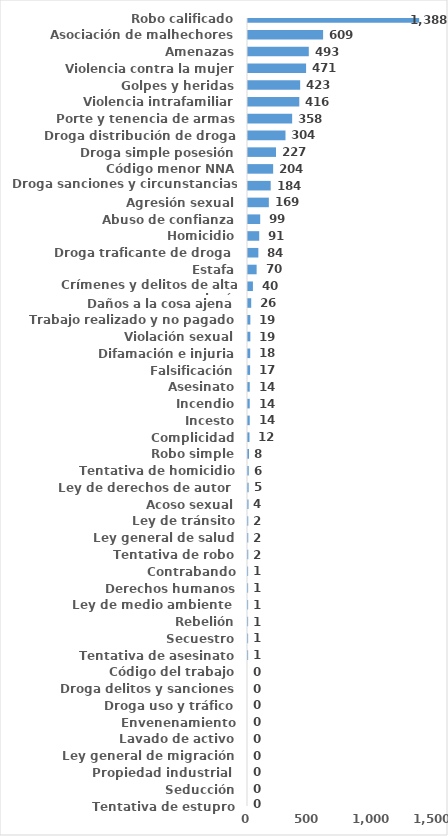
| Category | Series 0 |
|---|---|
| Robo calificado | 1388 |
| Asociación de malhechores | 609 |
| Amenazas | 493 |
| Violencia contra la mujer | 471 |
| Golpes y heridas | 423 |
| Violencia intrafamiliar | 416 |
| Porte y tenencia de armas | 358 |
| Droga distribución de droga | 304 |
| Droga simple posesión | 227 |
| Código menor NNA | 204 |
| Droga sanciones y circunstancias agravantes | 184 |
| Agresión sexual | 169 |
| Abuso de confianza | 99 |
| Homicidio | 91 |
| Droga traficante de droga  | 84 |
| Estafa | 70 |
| Crímenes y delitos de alta tecnología | 40 |
| Daños a la cosa ajena | 26 |
| Trabajo realizado y no pagado | 19 |
| Violación sexual | 19 |
| Difamación e injuria | 18 |
| Falsificación | 17 |
| Asesinato | 14 |
| Incendio | 14 |
| Incesto | 14 |
| Complicidad | 12 |
| Robo simple | 8 |
| Tentativa de homicidio | 6 |
| Ley de derechos de autor  | 5 |
| Acoso sexual | 4 |
| Ley de tránsito | 2 |
| Ley general de salud | 2 |
| Tentativa de robo | 2 |
| Contrabando | 1 |
| Derechos humanos | 1 |
| Ley de medio ambiente  | 1 |
| Rebelión | 1 |
| Secuestro | 1 |
| Tentativa de asesinato | 1 |
| Código del trabajo | 0 |
| Droga delitos y sanciones | 0 |
| Droga uso y tráfico | 0 |
| Envenenamiento | 0 |
| Lavado de activo | 0 |
| Ley general de migración | 0 |
| Propiedad industrial  | 0 |
| Seducción | 0 |
| Tentativa de estupro | 0 |